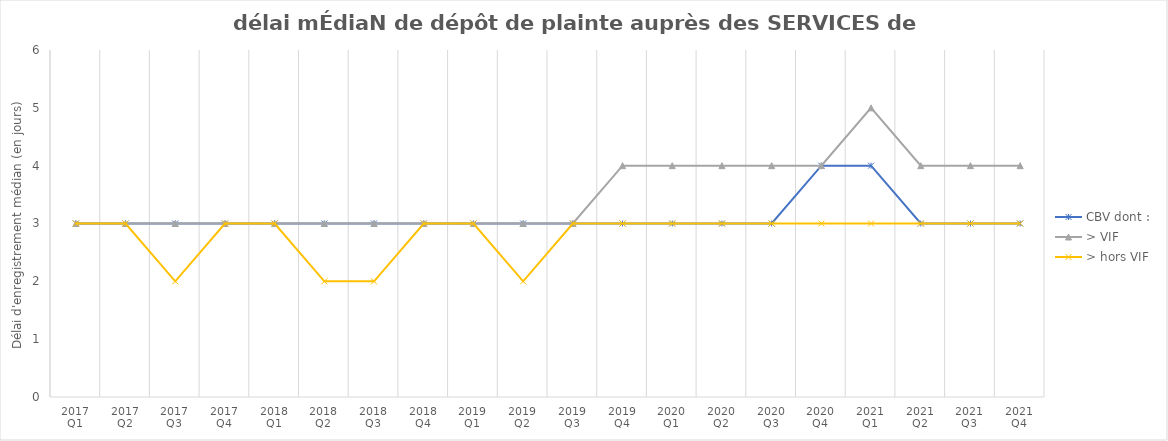
| Category | CBV dont : | > VIF | > hors VIF |
|---|---|---|---|
| 2017 Q1 | 3 | 3 | 3 |
| 2017 Q2 | 3 | 3 | 3 |
| 2017 Q3 | 3 | 3 | 2 |
| 2017 Q4 | 3 | 3 | 3 |
| 2018 Q1 | 3 | 3 | 3 |
| 2018 Q2 | 3 | 3 | 2 |
| 2018 Q3 | 3 | 3 | 2 |
| 2018 Q4 | 3 | 3 | 3 |
| 2019 Q1 | 3 | 3 | 3 |
| 2019 Q2 | 3 | 3 | 2 |
| 2019 Q3 | 3 | 3 | 3 |
| 2019 Q4 | 3 | 4 | 3 |
| 2020 Q1 | 3 | 4 | 3 |
| 2020 Q2 | 3 | 4 | 3 |
| 2020 Q3 | 3 | 4 | 3 |
| 2020 Q4 | 4 | 4 | 3 |
| 2021 Q1 | 4 | 5 | 3 |
| 2021 Q2 | 3 | 4 | 3 |
| 2021 Q3 | 3 | 4 | 3 |
| 2021 Q4 | 3 | 4 | 3 |